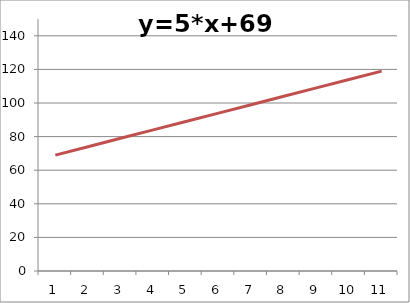
| Category | y |
|---|---|
| 0 | 69 |
| 1 | 74 |
| 2 | 79 |
| 3 | 84 |
| 4 | 89 |
| 5 | 94 |
| 6 | 99 |
| 7 | 104 |
| 8 | 109 |
| 9 | 114 |
| 10 | 119 |